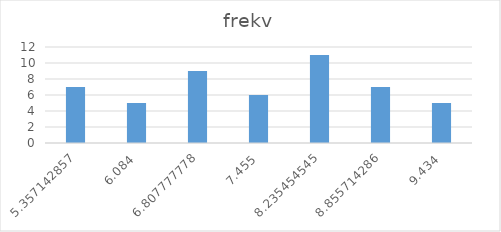
| Category | frekv |
|---|---|
| 5.357142857142866 | 7 |
| 6.08399999999998 | 5 |
| 6.807777777777773 | 9 |
| 7.455000000000003 | 6 |
| 8.23545454545455 | 11 |
| 8.855714285714283 | 7 |
| 9.434 | 5 |